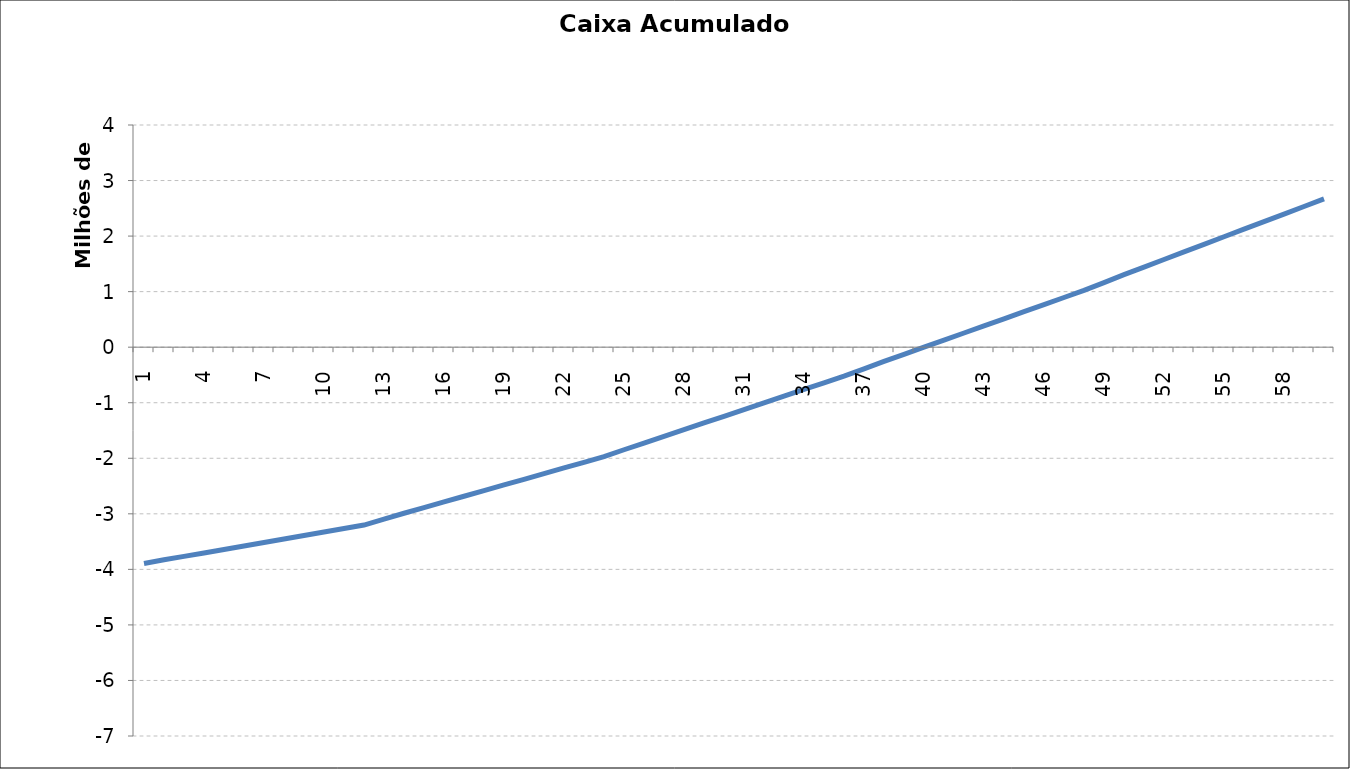
| Category | Caixa Acumulado [R$] |
|---|---|
| 0 | -3894001.194 |
| 1 | -3827341.981 |
| 2 | -3765612.969 |
| 3 | -3703883.957 |
| 4 | -3642154.945 |
| 5 | -3580425.932 |
| 6 | -3517434.641 |
| 7 | -3454443.35 |
| 8 | -3391452.059 |
| 9 | -3328460.767 |
| 10 | -3265469.476 |
| 11 | -3202478.185 |
| 12 | -3097035.507 |
| 13 | -2989875.092 |
| 14 | -2887940.689 |
| 15 | -2786006.286 |
| 16 | -2684071.883 |
| 17 | -2582137.48 |
| 18 | -2480203.077 |
| 19 | -2378268.674 |
| 20 | -2276334.271 |
| 21 | -2174399.868 |
| 22 | -2072465.465 |
| 23 | -1970531.062 |
| 24 | -1846417.803 |
| 25 | -1725888.673 |
| 26 | -1605359.544 |
| 27 | -1484830.415 |
| 28 | -1364301.285 |
| 29 | -1243772.156 |
| 30 | -1123243.027 |
| 31 | -1002713.897 |
| 32 | -882184.768 |
| 33 | -761655.639 |
| 34 | -641126.509 |
| 35 | -520597.38 |
| 36 | -389043.159 |
| 37 | -255421.722 |
| 38 | -127672.232 |
| 39 | 77.258 |
| 40 | 127826.748 |
| 41 | 255576.238 |
| 42 | 383325.728 |
| 43 | 511075.218 |
| 44 | 638824.708 |
| 45 | 766574.197 |
| 46 | 894323.687 |
| 47 | 1022073.177 |
| 48 | 1162550.722 |
| 49 | 1305225.666 |
| 50 | 1441676.347 |
| 51 | 1578127.027 |
| 52 | 1714577.708 |
| 53 | 1851028.388 |
| 54 | 1987479.069 |
| 55 | 2123929.749 |
| 56 | 2260380.43 |
| 57 | 2396831.11 |
| 58 | 2533281.79 |
| 59 | 2669732.471 |